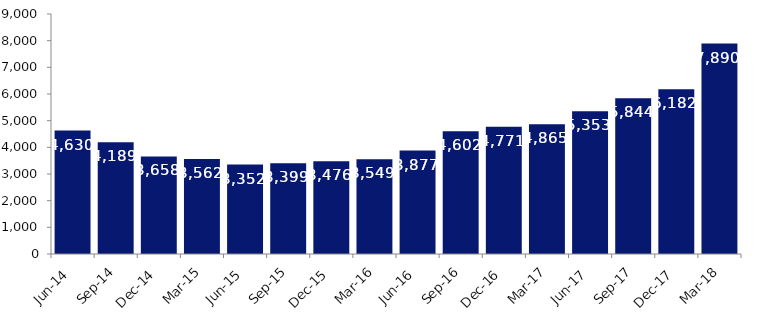
| Category | Series 0 |
|---|---|
| Jun-14 | 4630 |
| Sep-14 | 4189 |
| Dec-14 | 3658 |
| Mar-15 | 3562 |
| Jun-15 | 3352 |
| Sep-15 | 3399 |
| Dec-15 | 3476 |
| Mar-16 | 3549 |
| Jun-16 | 3877 |
| Sep-16 | 4602 |
| Dec-16 | 4771 |
| Mar-17 | 4865 |
| Jun-17 | 5353 |
| Sep-17 | 5844 |
| Dec-17 | 6182 |
| Mar-18 | 7890 |